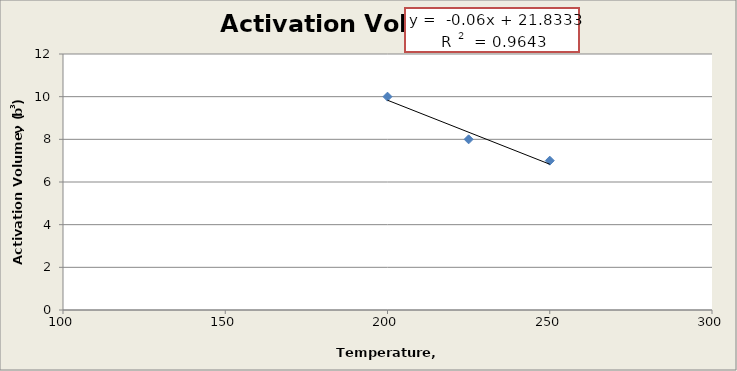
| Category | Series 0 |
|---|---|
| 200.0 | 10 |
| 225.0 | 8 |
| 250.0 | 7 |